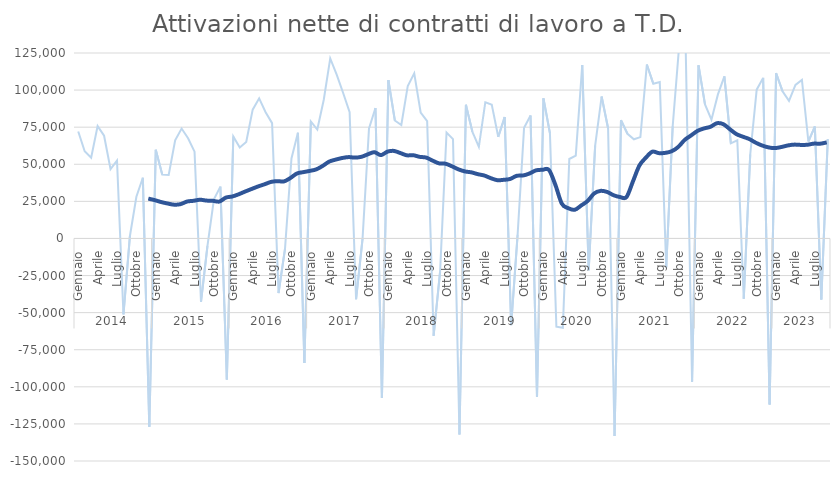
| Category | T.D. |
|---|---|
| 0 | 72122 |
| 1 | 58785 |
| 2 | 54412 |
| 3 | 75728 |
| 4 | 69256 |
| 5 | 46756 |
| 6 | 52518 |
| 7 | -51175 |
| 8 | 1663 |
| 9 | 28120 |
| 10 | 40951 |
| 11 | -126910 |
| 12 | 59739 |
| 13 | 43121 |
| 14 | 42787 |
| 15 | 66188 |
| 16 | 74070 |
| 17 | 67549 |
| 18 | 58481 |
| 19 | -42717 |
| 20 | -5065 |
| 21 | 26327 |
| 22 | 34954 |
| 23 | -95020 |
| 24 | 68748 |
| 25 | 61264 |
| 26 | 65032 |
| 27 | 86807 |
| 28 | 94453 |
| 29 | 85050 |
| 30 | 77707 |
| 31 | -36790 |
| 32 | -6991 |
| 33 | 53884 |
| 34 | 71296 |
| 35 | -83957 |
| 36 | 78852 |
| 37 | 73393 |
| 38 | 93528 |
| 39 | 121331 |
| 40 | 110428 |
| 41 | 98049 |
| 42 | 85085 |
| 43 | -40974 |
| 44 | -248 |
| 45 | 74206 |
| 46 | 87896 |
| 47 | -107524 |
| 48 | 106731 |
| 49 | 79523 |
| 50 | 76489 |
| 51 | 102792 |
| 52 | 111297 |
| 53 | 84810 |
| 54 | 79060 |
| 55 | -65568 |
| 56 | -22487 |
| 57 | 71408 |
| 58 | 66981 |
| 59 | -132144 |
| 60 | 90058 |
| 61 | 71896 |
| 62 | 61790 |
| 63 | 91789 |
| 64 | 90153 |
| 65 | 68463 |
| 66 | 81840 |
| 67 | -58422 |
| 68 | 2530 |
| 69 | 74610 |
| 70 | 82888 |
| 71 | -106794 |
| 72 | 94418 |
| 73 | 71006 |
| 74 | -59420 |
| 75 | -60176 |
| 76 | 53560 |
| 77 | 55798 |
| 78 | 116865 |
| 79 | -21480 |
| 80 | 62552 |
| 81 | 95636 |
| 82 | 74297 |
| 83 | -133212 |
| 84 | 79714 |
| 85 | 70566 |
| 86 | 66821 |
| 87 | 68322 |
| 88 | 117214 |
| 89 | 104286 |
| 90 | 105431 |
| 91 | -19399 |
| 92 | 75628 |
| 93 | 129831 |
| 94 | 131249 |
| 95 | -96558 |
| 96 | 116663 |
| 97 | 90366 |
| 98 | 80069 |
| 99 | 97101 |
| 100 | 109244 |
| 101 | 64139 |
| 102 | 66172 |
| 103 | -40617 |
| 104 | 56576 |
| 105 | 100292 |
| 106 | 108222 |
| 107 | -111942 |
| 108 | 111413 |
| 109 | 99229 |
| 110 | 92702 |
| 111 | 103517 |
| 112 | 106902 |
| 113 | 65347 |
| 114 | 75406 |
| 115 | -41096 |
| 116 | 66946 |